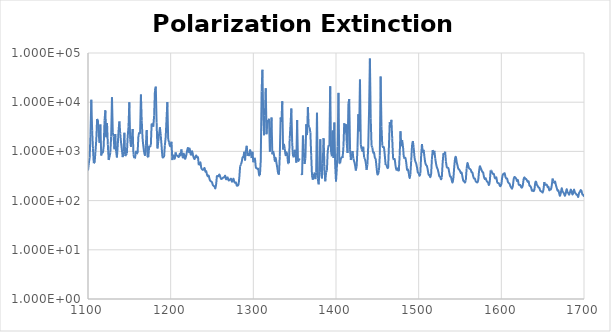
| Category | Series 0 |
|---|---|
| 1100.0 | 408.402 |
| 1101.0 | 574.134 |
| 1102.0 | 746.876 |
| 1103.0 | 2168.072 |
| 1104.0 | 11164.979 |
| 1105.0 | 2688.481 |
| 1106.0 | 1131.848 |
| 1107.0 | 577.639 |
| 1108.0 | 586.634 |
| 1109.0 | 988.604 |
| 1110.0 | 1723.067 |
| 1111.0 | 4573.938 |
| 1112.0 | 4314.386 |
| 1113.0 | 2157.548 |
| 1114.0 | 1497.982 |
| 1115.0 | 3508.861 |
| 1116.0 | 823.357 |
| 1117.0 | 985.464 |
| 1118.0 | 957.017 |
| 1119.0 | 1289.365 |
| 1120.0 | 4259.046 |
| 1121.0 | 6829.276 |
| 1122.0 | 1946.847 |
| 1123.0 | 3764.531 |
| 1124.0 | 1379.196 |
| 1125.0 | 670.999 |
| 1126.0 | 761.082 |
| 1127.0 | 952.137 |
| 1128.0 | 2004.733 |
| 1129.0 | 12564.101 |
| 1130.0 | 2382.051 |
| 1131.0 | 2005.224 |
| 1132.0 | 1108.497 |
| 1133.0 | 2260.556 |
| 1134.0 | 1016.96 |
| 1135.0 | 751.906 |
| 1136.0 | 1345.651 |
| 1137.0 | 2651.567 |
| 1138.0 | 4070.015 |
| 1139.0 | 2299.398 |
| 1140.0 | 1507.655 |
| 1141.0 | 1074.734 |
| 1142.0 | 765.087 |
| 1143.0 | 1000.86 |
| 1144.0 | 2401.767 |
| 1145.0 | 802.843 |
| 1146.0 | 843.687 |
| 1147.0 | 907.235 |
| 1148.0 | 1965.589 |
| 1149.0 | 3173.117 |
| 1150.0 | 9951.097 |
| 1151.0 | 1732.776 |
| 1152.0 | 1237.436 |
| 1153.0 | 1700.789 |
| 1154.0 | 2847.391 |
| 1155.0 | 852.445 |
| 1156.0 | 729.812 |
| 1157.0 | 753.857 |
| 1158.0 | 1024.596 |
| 1159.0 | 890.363 |
| 1160.0 | 925.99 |
| 1161.0 | 2063.746 |
| 1162.0 | 2440.389 |
| 1163.0 | 2293.77 |
| 1164.0 | 14326.362 |
| 1165.0 | 4245.004 |
| 1166.0 | 1893.396 |
| 1167.0 | 1259.266 |
| 1168.0 | 946.312 |
| 1169.0 | 817.563 |
| 1170.0 | 1339.721 |
| 1171.0 | 2726.299 |
| 1172.0 | 768.728 |
| 1173.0 | 760.845 |
| 1174.0 | 1292.914 |
| 1175.0 | 1223.499 |
| 1176.0 | 1321.277 |
| 1177.0 | 3687.505 |
| 1178.0 | 3630.357 |
| 1179.0 | 3174.955 |
| 1180.0 | 5314.823 |
| 1181.0 | 17573.9 |
| 1182.0 | 20738.687 |
| 1183.0 | 3810.633 |
| 1184.0 | 1148.736 |
| 1185.0 | 1576.219 |
| 1186.0 | 2244.965 |
| 1187.0 | 3098.104 |
| 1188.0 | 2123.122 |
| 1189.0 | 1294.999 |
| 1190.0 | 794.417 |
| 1191.0 | 757.936 |
| 1192.0 | 763.478 |
| 1193.0 | 1337.152 |
| 1194.0 | 1959.424 |
| 1195.0 | 4531.109 |
| 1196.0 | 10040.305 |
| 1197.0 | 1778.932 |
| 1198.0 | 1533.351 |
| 1199.0 | 1308.436 |
| 1200.0 | 1286.075 |
| 1201.0 | 1573.839 |
| 1202.0 | 665.457 |
| 1203.0 | 855.539 |
| 1204.0 | 762.165 |
| 1205.0 | 715.632 |
| 1206.0 | 953.513 |
| 1207.0 | 801.908 |
| 1208.0 | 813.62 |
| 1209.0 | 780.925 |
| 1210.0 | 775.584 |
| 1211.0 | 899.499 |
| 1212.0 | 833.891 |
| 1213.0 | 1098.676 |
| 1214.0 | 801.945 |
| 1215.0 | 752.835 |
| 1216.0 | 901.665 |
| 1217.0 | 722.479 |
| 1218.0 | 726.521 |
| 1219.0 | 861.036 |
| 1220.0 | 1053.6 |
| 1221.0 | 1177.017 |
| 1222.0 | 965.765 |
| 1223.0 | 1142.512 |
| 1224.0 | 894.56 |
| 1225.0 | 865.027 |
| 1226.0 | 1011.572 |
| 1227.0 | 839.398 |
| 1228.0 | 737.544 |
| 1229.0 | 700.112 |
| 1230.0 | 779.006 |
| 1231.0 | 829.957 |
| 1232.0 | 754.36 |
| 1233.0 | 788.328 |
| 1234.0 | 526.302 |
| 1235.0 | 546.394 |
| 1236.0 | 595.967 |
| 1237.0 | 464.377 |
| 1238.0 | 432.622 |
| 1239.0 | 421.178 |
| 1240.0 | 431.393 |
| 1241.0 | 459.032 |
| 1242.0 | 388.428 |
| 1243.0 | 395.467 |
| 1244.0 | 335.142 |
| 1245.0 | 311.245 |
| 1246.0 | 321.904 |
| 1247.0 | 274.433 |
| 1248.0 | 251.607 |
| 1249.0 | 244.89 |
| 1250.0 | 235.338 |
| 1251.0 | 208.286 |
| 1252.0 | 199.036 |
| 1253.0 | 193.893 |
| 1254.0 | 177.311 |
| 1255.0 | 215.748 |
| 1256.0 | 324.847 |
| 1257.0 | 304.105 |
| 1258.0 | 320.088 |
| 1259.0 | 338.578 |
| 1260.0 | 302.888 |
| 1261.0 | 276.147 |
| 1262.0 | 279.398 |
| 1263.0 | 287.449 |
| 1264.0 | 296.189 |
| 1265.0 | 298.744 |
| 1266.0 | 319.842 |
| 1267.0 | 272.108 |
| 1268.0 | 285.773 |
| 1269.0 | 294.567 |
| 1270.0 | 257.99 |
| 1271.0 | 260.975 |
| 1272.0 | 269.369 |
| 1273.0 | 277.349 |
| 1274.0 | 243.382 |
| 1275.0 | 256.888 |
| 1276.0 | 278.589 |
| 1277.0 | 239.896 |
| 1278.0 | 229.283 |
| 1279.0 | 232.144 |
| 1280.0 | 202.184 |
| 1281.0 | 202.702 |
| 1282.0 | 211.212 |
| 1283.0 | 288.352 |
| 1284.0 | 499.97 |
| 1285.0 | 541.374 |
| 1286.0 | 619.129 |
| 1287.0 | 756.846 |
| 1288.0 | 768.53 |
| 1289.0 | 982.388 |
| 1290.0 | 653.236 |
| 1291.0 | 1069.858 |
| 1292.0 | 1299.837 |
| 1293.0 | 812.751 |
| 1294.0 | 934.766 |
| 1295.0 | 801.279 |
| 1296.0 | 1090.32 |
| 1297.0 | 950.322 |
| 1298.0 | 732.1 |
| 1299.0 | 986.664 |
| 1300.0 | 601.7 |
| 1301.0 | 729.68 |
| 1302.0 | 696.774 |
| 1303.0 | 479.085 |
| 1304.0 | 459.943 |
| 1305.0 | 439.177 |
| 1306.0 | 438.328 |
| 1307.0 | 330.843 |
| 1308.0 | 329.522 |
| 1309.0 | 666.733 |
| 1310.0 | 16411.725 |
| 1311.0 | 45868.675 |
| 1312.0 | 4785.326 |
| 1313.0 | 2128.704 |
| 1314.0 | 5349.763 |
| 1315.0 | 19157.267 |
| 1316.0 | 2231.53 |
| 1317.0 | 4334.7 |
| 1318.0 | 3897.174 |
| 1319.0 | 4604.639 |
| 1320.0 | 983.476 |
| 1321.0 | 1797.945 |
| 1322.0 | 4894.112 |
| 1323.0 | 871.356 |
| 1324.0 | 1017.855 |
| 1325.0 | 846.652 |
| 1326.0 | 639.69 |
| 1327.0 | 738.256 |
| 1328.0 | 580.312 |
| 1329.0 | 459.057 |
| 1330.0 | 360.748 |
| 1331.0 | 337.474 |
| 1332.0 | 797.114 |
| 1333.0 | 4896.713 |
| 1334.0 | 3968.443 |
| 1335.0 | 10448.19 |
| 1336.0 | 1090.386 |
| 1337.0 | 1420.178 |
| 1338.0 | 1141.043 |
| 1339.0 | 840.819 |
| 1340.0 | 960.789 |
| 1341.0 | 854.397 |
| 1342.0 | 590.185 |
| 1343.0 | 576.618 |
| 1344.0 | 1805.158 |
| 1345.0 | 3548.026 |
| 1346.0 | 7449.22 |
| 1347.0 | 1489.502 |
| 1348.0 | 790.279 |
| 1349.0 | 764.706 |
| 1350.0 | 1077.808 |
| 1351.0 | 914.237 |
| 1352.0 | 590.889 |
| 1353.0 | 4363.949 |
| 1354.0 | 624.71 |
| 1355.0 | 649.343 |
| 1356.0 | 718.536 |
| 1357.0 | 0 |
| 1358.0 | 353.692 |
| 1359.0 | 333.612 |
| 1360.0 | 2102.563 |
| 1361.0 | 1006.193 |
| 1362.0 | 554.521 |
| 1363.0 | 723.583 |
| 1364.0 | 3555.9 |
| 1365.0 | 2143.119 |
| 1366.0 | 7984.696 |
| 1367.0 | 3087.983 |
| 1368.0 | 3088.827 |
| 1369.0 | 2416.623 |
| 1370.0 | 834.003 |
| 1371.0 | 318.409 |
| 1372.0 | 265.982 |
| 1373.0 | 350.93 |
| 1374.0 | 353.096 |
| 1375.0 | 273.33 |
| 1376.0 | 368.131 |
| 1377.0 | 6086.986 |
| 1378.0 | 279.231 |
| 1379.0 | 213.853 |
| 1380.0 | 397.694 |
| 1381.0 | 1758.066 |
| 1382.0 | 375.56 |
| 1383.0 | 282.532 |
| 1384.0 | 560.642 |
| 1385.0 | 1859.76 |
| 1386.0 | 487.68 |
| 1387.0 | 246.31 |
| 1388.0 | 373.411 |
| 1389.0 | 411.536 |
| 1390.0 | 1018.265 |
| 1391.0 | 1332.278 |
| 1392.0 | 1274.543 |
| 1393.0 | 21098.936 |
| 1394.0 | 972.049 |
| 1395.0 | 797.846 |
| 1396.0 | 2664.814 |
| 1397.0 | 734.985 |
| 1398.0 | 3873.613 |
| 1399.0 | 530.677 |
| 1400.0 | 245.02 |
| 1401.0 | 457.046 |
| 1402.0 | 1261.504 |
| 1403.0 | 15474.077 |
| 1404.0 | 569.215 |
| 1405.0 | 574.434 |
| 1406.0 | 714.604 |
| 1407.0 | 763.702 |
| 1408.0 | 737.235 |
| 1409.0 | 1240.886 |
| 1410.0 | 3744.533 |
| 1411.0 | 2419.781 |
| 1412.0 | 3575.299 |
| 1413.0 | 1468.282 |
| 1414.0 | 928.684 |
| 1415.0 | 9288.346 |
| 1416.0 | 11589.999 |
| 1417.0 | 1073.257 |
| 1418.0 | 670.363 |
| 1419.0 | 773.678 |
| 1420.0 | 1019.479 |
| 1421.0 | 715.105 |
| 1422.0 | 623.168 |
| 1423.0 | 529.104 |
| 1424.0 | 408.549 |
| 1425.0 | 501.119 |
| 1426.0 | 1180.203 |
| 1427.0 | 5671 |
| 1428.0 | 2551.311 |
| 1429.0 | 29041.012 |
| 1430.0 | 1370.994 |
| 1431.0 | 1108.717 |
| 1432.0 | 1025.141 |
| 1433.0 | 1246.103 |
| 1434.0 | 752.664 |
| 1435.0 | 709.341 |
| 1436.0 | 584.601 |
| 1437.0 | 422.23 |
| 1438.0 | 539.28 |
| 1439.0 | 1290.622 |
| 1440.0 | 6630.049 |
| 1441.0 | 77201.758 |
| 1442.0 | 4636.792 |
| 1443.0 | 1302.871 |
| 1444.0 | 1195.086 |
| 1445.0 | 945.938 |
| 1446.0 | 946.1 |
| 1447.0 | 747.942 |
| 1448.0 | 692.827 |
| 1449.0 | 487.36 |
| 1450.0 | 347.801 |
| 1451.0 | 350.975 |
| 1452.0 | 412.864 |
| 1453.0 | 825.271 |
| 1454.0 | 33147.215 |
| 1455.0 | 3218.063 |
| 1456.0 | 1317.384 |
| 1457.0 | 1188.55 |
| 1458.0 | 1195.28 |
| 1459.0 | 838.151 |
| 1460.0 | 530.228 |
| 1461.0 | 539.197 |
| 1462.0 | 470.323 |
| 1463.0 | 447.113 |
| 1464.0 | 1233.651 |
| 1465.0 | 3928.516 |
| 1466.0 | 3049.597 |
| 1467.0 | 4377.151 |
| 1468.0 | 1855.441 |
| 1469.0 | 736.185 |
| 1470.0 | 668.755 |
| 1471.0 | 694.662 |
| 1472.0 | 514.53 |
| 1473.0 | 424.414 |
| 1474.0 | 453.397 |
| 1475.0 | 415.139 |
| 1476.0 | 396.59 |
| 1477.0 | 833.651 |
| 1478.0 | 2575.116 |
| 1479.0 | 1273.674 |
| 1480.0 | 1705.498 |
| 1481.0 | 1296.635 |
| 1482.0 | 768.358 |
| 1483.0 | 711.937 |
| 1484.0 | 734.89 |
| 1485.0 | 583.101 |
| 1486.0 | 424.996 |
| 1487.0 | 427.806 |
| 1488.0 | 361.316 |
| 1489.0 | 287.197 |
| 1490.0 | 344.992 |
| 1491.0 | 656.928 |
| 1492.0 | 1351.291 |
| 1493.0 | 1625.268 |
| 1494.0 | 1189.936 |
| 1495.0 | 752.928 |
| 1496.0 | 625.335 |
| 1497.0 | 565.813 |
| 1498.0 | 469.241 |
| 1499.0 | 374.942 |
| 1500.0 | 360.747 |
| 1501.0 | 318.647 |
| 1502.0 | 351.28 |
| 1503.0 | 809.456 |
| 1504.0 | 1408.527 |
| 1505.0 | 945.779 |
| 1506.0 | 1079.096 |
| 1507.0 | 772.298 |
| 1508.0 | 585.968 |
| 1509.0 | 528.084 |
| 1510.0 | 503.618 |
| 1511.0 | 419.424 |
| 1512.0 | 337.959 |
| 1513.0 | 330.935 |
| 1514.0 | 298.109 |
| 1515.0 | 331.62 |
| 1516.0 | 695.655 |
| 1517.0 | 1068.066 |
| 1518.0 | 862.13 |
| 1519.0 | 1025.089 |
| 1520.0 | 724.68 |
| 1521.0 | 565.815 |
| 1522.0 | 476.993 |
| 1523.0 | 434.345 |
| 1524.0 | 369.232 |
| 1525.0 | 312.368 |
| 1526.0 | 306.159 |
| 1527.0 | 270.787 |
| 1528.0 | 294.133 |
| 1529.0 | 581.669 |
| 1530.0 | 924.738 |
| 1531.0 | 859.758 |
| 1532.0 | 986.441 |
| 1533.0 | 623.92 |
| 1534.0 | 481.878 |
| 1535.0 | 466.165 |
| 1536.0 | 452.86 |
| 1537.0 | 371.566 |
| 1538.0 | 311.62 |
| 1539.0 | 304.085 |
| 1540.0 | 258.706 |
| 1541.0 | 233.097 |
| 1542.0 | 289.609 |
| 1543.0 | 475.923 |
| 1544.0 | 710.566 |
| 1545.0 | 771.334 |
| 1546.0 | 609.05 |
| 1547.0 | 516.73 |
| 1548.0 | 443.356 |
| 1549.0 | 427.72 |
| 1550.0 | 402.075 |
| 1551.0 | 363.556 |
| 1552.0 | 369.083 |
| 1553.0 | 302.473 |
| 1554.0 | 254.028 |
| 1555.0 | 247.611 |
| 1556.0 | 232.612 |
| 1557.0 | 256.886 |
| 1558.0 | 444.027 |
| 1559.0 | 579.174 |
| 1560.0 | 514.962 |
| 1561.0 | 452.731 |
| 1562.0 | 440.17 |
| 1563.0 | 423.122 |
| 1564.0 | 377.272 |
| 1565.0 | 371.277 |
| 1566.0 | 310.741 |
| 1567.0 | 281.286 |
| 1568.0 | 280.038 |
| 1569.0 | 246.601 |
| 1570.0 | 239.197 |
| 1571.0 | 234.752 |
| 1572.0 | 259.01 |
| 1573.0 | 387.376 |
| 1574.0 | 496.522 |
| 1575.0 | 461.025 |
| 1576.0 | 420.309 |
| 1577.0 | 384.223 |
| 1578.0 | 371.879 |
| 1579.0 | 302.976 |
| 1580.0 | 274.447 |
| 1581.0 | 284.899 |
| 1582.0 | 255.871 |
| 1583.0 | 240.627 |
| 1584.0 | 231.775 |
| 1585.0 | 207.306 |
| 1586.0 | 244.062 |
| 1587.0 | 410.245 |
| 1588.0 | 408.158 |
| 1589.0 | 363.768 |
| 1590.0 | 348.849 |
| 1591.0 | 345.233 |
| 1592.0 | 291.309 |
| 1593.0 | 282.796 |
| 1594.0 | 294.761 |
| 1595.0 | 237.27 |
| 1596.0 | 227.164 |
| 1597.0 | 224.382 |
| 1598.0 | 203.593 |
| 1599.0 | 196.915 |
| 1600.0 | 213.869 |
| 1601.0 | 292.32 |
| 1602.0 | 343.059 |
| 1603.0 | 343.442 |
| 1604.0 | 360.185 |
| 1605.0 | 303.42 |
| 1606.0 | 281.528 |
| 1607.0 | 278.5 |
| 1608.0 | 238.971 |
| 1609.0 | 227 |
| 1610.0 | 219.278 |
| 1611.0 | 195.248 |
| 1612.0 | 184.117 |
| 1613.0 | 175.421 |
| 1614.0 | 202.584 |
| 1615.0 | 278.095 |
| 1616.0 | 302.678 |
| 1617.0 | 291.828 |
| 1618.0 | 278.068 |
| 1619.0 | 249.969 |
| 1620.0 | 261.954 |
| 1621.0 | 214.064 |
| 1622.0 | 206.137 |
| 1623.0 | 206.642 |
| 1624.0 | 188.227 |
| 1625.0 | 184.351 |
| 1626.0 | 206.287 |
| 1627.0 | 274.072 |
| 1628.0 | 297.055 |
| 1629.0 | 276.709 |
| 1630.0 | 274.642 |
| 1631.0 | 257.676 |
| 1632.0 | 239.965 |
| 1633.0 | 246.201 |
| 1634.0 | 201.9 |
| 1635.0 | 196.862 |
| 1636.0 | 183.817 |
| 1637.0 | 159.34 |
| 1638.0 | 162.099 |
| 1639.0 | 155.564 |
| 1640.0 | 167.02 |
| 1641.0 | 228.466 |
| 1642.0 | 242.078 |
| 1643.0 | 210.712 |
| 1644.0 | 198.473 |
| 1645.0 | 184.391 |
| 1646.0 | 182.086 |
| 1647.0 | 160.357 |
| 1648.0 | 154.782 |
| 1649.0 | 152.186 |
| 1650.0 | 146.149 |
| 1651.0 | 169.224 |
| 1652.0 | 238.648 |
| 1653.0 | 203.996 |
| 1654.0 | 209.511 |
| 1655.0 | 209.975 |
| 1656.0 | 188.037 |
| 1657.0 | 190.418 |
| 1658.0 | 161.902 |
| 1659.0 | 170.82 |
| 1660.0 | 169.591 |
| 1661.0 | 203.215 |
| 1662.0 | 280.242 |
| 1663.0 | 243.94 |
| 1664.0 | 231.03 |
| 1665.0 | 244.077 |
| 1666.0 | 206.897 |
| 1667.0 | 181.279 |
| 1668.0 | 159.516 |
| 1669.0 | 161.606 |
| 1670.0 | 139.927 |
| 1671.0 | 124.954 |
| 1672.0 | 144.345 |
| 1673.0 | 177.998 |
| 1674.0 | 154.231 |
| 1675.0 | 147.322 |
| 1676.0 | 135.97 |
| 1677.0 | 125.168 |
| 1678.0 | 142.488 |
| 1679.0 | 170.892 |
| 1680.0 | 149.679 |
| 1681.0 | 142.501 |
| 1682.0 | 131.877 |
| 1683.0 | 146.705 |
| 1684.0 | 167.385 |
| 1685.0 | 151.27 |
| 1686.0 | 132.528 |
| 1687.0 | 146.427 |
| 1688.0 | 168.494 |
| 1689.0 | 146.023 |
| 1690.0 | 140.06 |
| 1691.0 | 131.373 |
| 1692.0 | 130.395 |
| 1693.0 | 118.661 |
| 1694.0 | 142.462 |
| 1695.0 | 149.714 |
| 1696.0 | 163.189 |
| 1697.0 | 156.414 |
| 1698.0 | 133.721 |
| 1699.0 | 130.979 |
| 1700.0 | 120.478 |